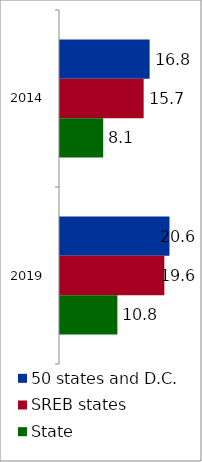
| Category | 50 states and D.C. | SREB states | State |
|---|---|---|---|
| 2014.0 | 16.846 | 15.724 | 8.119 |
| 2019.0 | 20.578 | 19.613 | 10.785 |